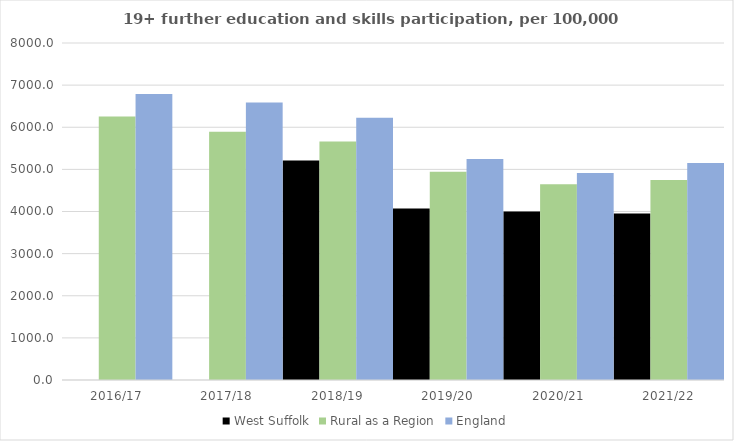
| Category | West Suffolk | Rural as a Region | England |
|---|---|---|---|
| 2016/17 | 0 | 6253.401 | 6788 |
| 2017/18 | 0 | 5892.029 | 6588 |
| 2018/19 | 5210 | 5661.873 | 6227 |
| 2019/20 | 4073 | 4943.801 | 5244 |
| 2020/21 | 4001 | 4646.727 | 4913 |
| 2021/22 | 3951 | 4747.049 | 5151 |